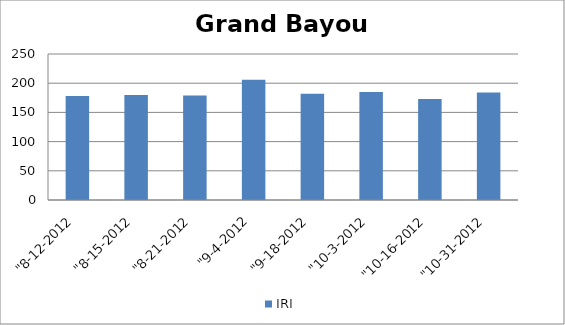
| Category | IRI |
|---|---|
| "8-12-2012 | 178 |
| "8-15-2012 | 180 |
| "8-21-2012 | 179 |
| "9-4-2012 | 206 |
| "9-18-2012 | 182 |
| "10-3-2012 | 185 |
| "10-16-2012 | 173 |
| "10-31-2012 | 184 |